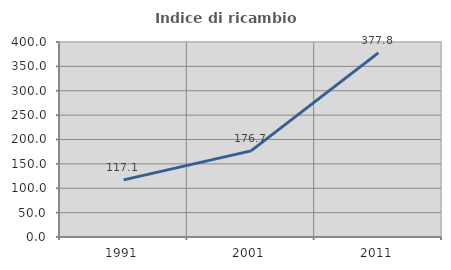
| Category | Indice di ricambio occupazionale  |
|---|---|
| 1991.0 | 117.114 |
| 2001.0 | 176.743 |
| 2011.0 | 377.778 |